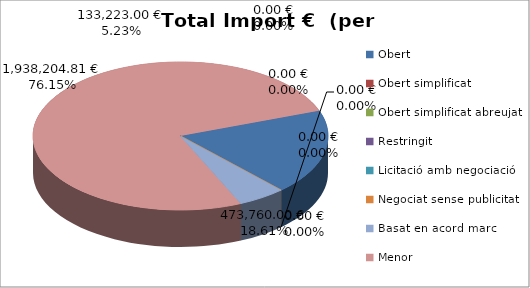
| Category | Total preu              (amb iva) |
|---|---|
| Obert | 473760 |
| Obert simplificat | 0 |
| Obert simplificat abreujat | 0 |
| Restringit | 0 |
| Licitació amb negociació | 0 |
| Negociat sense publicitat | 0 |
| Basat en acord marc | 133223 |
| Menor | 1938204.81 |